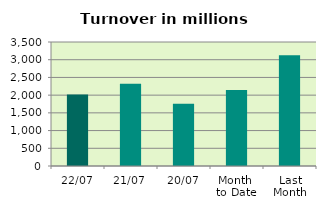
| Category | Series 0 |
|---|---|
| 22/07 | 2015.126 |
| 21/07 | 2321.548 |
| 20/07 | 1755.907 |
| Month 
to Date | 2147.606 |
| Last
Month | 3125.17 |